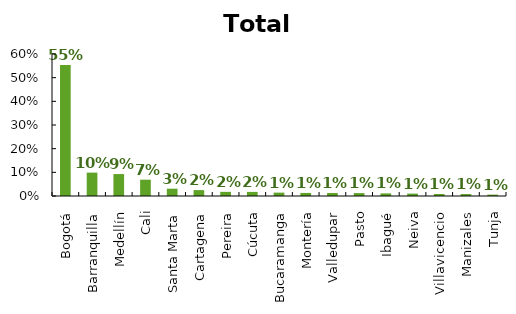
| Category | Total PND |
|---|---|
| Bogotá | 0.553 |
| Barranquilla | 0.099 |
| Medellín | 0.093 |
| Cali | 0.069 |
| Santa Marta | 0.031 |
| Cartagena | 0.025 |
| Pereira | 0.018 |
| Cúcuta | 0.017 |
| Bucaramanga | 0.014 |
| Montería | 0.013 |
| Valledupar | 0.013 |
| Pasto | 0.012 |
| Ibagué | 0.011 |
| Neiva | 0.01 |
| Villavicencio | 0.008 |
| Manizales | 0.008 |
| Tunja | 0.006 |